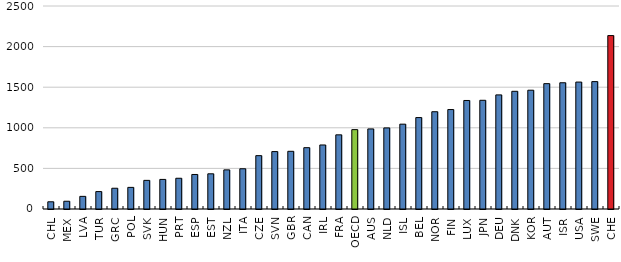
| Category | Series 0 |
|---|---|
| CHL | 88.873 |
| MEX | 95.561 |
| LVA | 155.636 |
| TUR | 214.418 |
| GRC | 255.603 |
| POL | 266.28 |
| SVK | 352.535 |
| HUN | 364.338 |
| PRT | 378.595 |
| ESP | 425.247 |
| EST | 433.453 |
| NZL | 481.909 |
| ITA | 495.667 |
| CZE | 657.063 |
| SVN | 707.053 |
| GBR | 710.487 |
| CAN | 755.15 |
| IRL | 788.472 |
| FRA | 913.331 |
| OECD | 977.4 |
| AUS | 986.056 |
| NLD | 998.684 |
| ISL | 1044.834 |
| BEL | 1125.992 |
| NOR | 1197.925 |
| FIN | 1224.772 |
| LUX | 1336.55 |
| JPN | 1338.807 |
| DEU | 1405.097 |
| DNK | 1449.527 |
| KOR | 1462.976 |
| AUT | 1543.677 |
| ISR | 1554.7 |
| USA | 1563.216 |
| SWE | 1568.668 |
| CHE | 2135.645 |